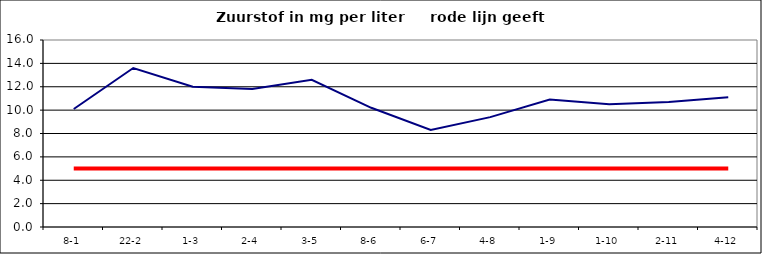
| Category | Series 0 | Series 1 |
|---|---|---|
| 8-1 | 10.1 | 5 |
| 22-2 | 13.6 | 5 |
| 1-3 | 12 | 5 |
| 2-4 | 11.8 | 5 |
| 3-5 | 12.6 | 5 |
| 8-6 | 10.2 | 5 |
| 6-7 | 8.3 | 5 |
| 4-8 | 9.4 | 5 |
| 1-9 | 10.9 | 5 |
| 1-10 | 10.5 | 5 |
| 2-11 | 10.7 | 5 |
| 4-12 | 11.1 | 5 |